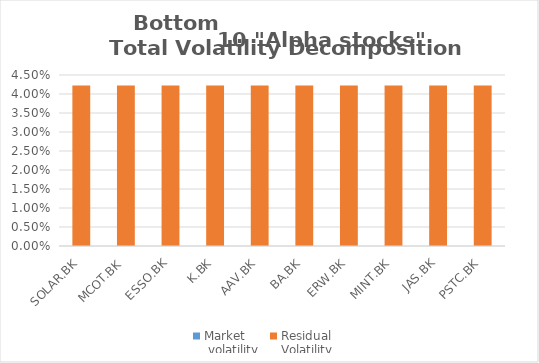
| Category | Market
 volatility | Residual
Volatility |
|---|---|---|
| SOLAR.BK | 0 | 0.042 |
| MCOT.BK | 0 | 0.042 |
| ESSO.BK | 0 | 0.042 |
| K.BK | 0 | 0.042 |
| AAV.BK | 0 | 0.042 |
| BA.BK | 0 | 0.042 |
| ERW.BK | 0 | 0.042 |
| MINT.BK | 0 | 0.042 |
| JAS.BK | 0 | 0.042 |
| PSTC.BK | 0 | 0.042 |